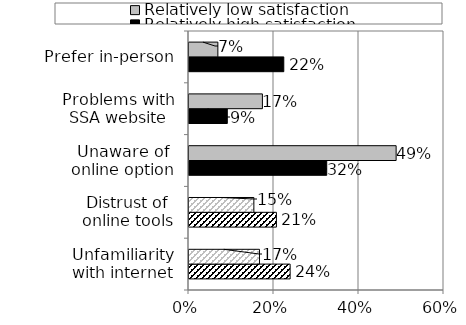
| Category | Relatively high satisfaction | Relatively low satisfaction |
|---|---|---|
| Unfamiliarity with internet | 0.238 | 0.166 |
| Distrust of online tools | 0.206 | 0.153 |
| Unaware of online option | 0.324 | 0.487 |
| Problems with SSA website | 0.09 | 0.173 |
| Prefer in-person | 0.223 | 0.068 |